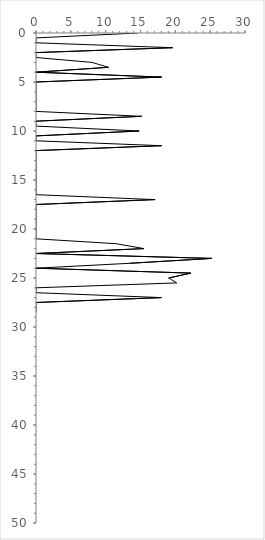
| Category | Series 0 |
|---|---|
| 14.61988304093567 | 0 |
| 0.0 | 0.5 |
| 0.0 | 1 |
| 19.607843137254903 | 1.5 |
| 0.0 | 2 |
| 0.0 | 2.5 |
| 8.032128514056224 | 3 |
| 10.416666666666666 | 3.5 |
| 0.0 | 4 |
| 18.01801801801802 | 4.5 |
| 0.0 | 5 |
| 0.0 | 5.5 |
| 0.0 | 6 |
| 0.0 | 6.5 |
| 0.0 | 7 |
| 0.0 | 7.5 |
| 0.0 | 8 |
| 15.15151515151515 | 8.5 |
| 0.0 | 9 |
| 0.0 | 9.5 |
| 14.814814814814815 | 10 |
| 0.0 | 10.5 |
| 0.0 | 11 |
| 18.018018018018015 | 11.5 |
| 0.0 | 12 |
| 0.0 | 12.5 |
| 0.0 | 13 |
| 0.0 | 13.5 |
| 0.0 | 14 |
| 0.0 | 14.5 |
| 0.0 | 15 |
| 0.0 | 15.5 |
| 0.0 | 16 |
| 0.0 | 16.5 |
| 17.094017094017094 | 17 |
| 0.0 | 17.5 |
| 0.0 | 18 |
| 0.0 | 18.5 |
| 0.0 | 19 |
| 0.0 | 19.5 |
| 0.0 | 20 |
| 0.0 | 20.5 |
| 0.0 | 21 |
| 11.494252873563218 | 21.5 |
| 15.503875968992249 | 22 |
| 0.0 | 22.5 |
| 25.245441795231415 | 23 |
| 13.44086021505376 | 23.5 |
| 0.0 | 24 |
| 22.222222222222218 | 24.5 |
| 19.047619047619047 | 25 |
| 20.2020202020202 | 25.5 |
| 0.0 | 26 |
| 0.0 | 26.5 |
| 18.018018018018015 | 27 |
| 0.0 | 27.5 |
| 0.0 | 28 |
| 0.0 | 28.5 |